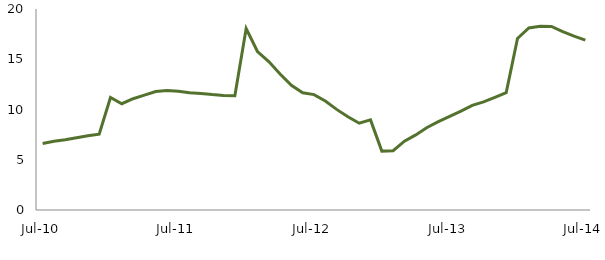
| Category | Series 0 |
|---|---|
| Jul-10 | 6.608 |
|  | 6.844 |
|  | 7 |
|  | 7.189 |
|  | 7.391 |
|  | 7.544 |
|  | 11.192 |
|  | 10.576 |
|  | 11.074 |
|  | 11.424 |
|  | 11.795 |
|  | 11.884 |
| Jul-11 | 11.821 |
|  | 11.67 |
|  | 11.588 |
|  | 11.481 |
|  | 11.403 |
|  | 11.374 |
|  | 18.05 |
|  | 15.769 |
|  | 14.767 |
|  | 13.533 |
|  | 12.403 |
|  | 11.663 |
| Jul-12 | 11.484 |
|  | 10.846 |
|  | 10.011 |
|  | 9.276 |
|  | 8.633 |
|  | 8.963 |
|  | 5.86 |
|  | 5.902 |
|  | 6.851 |
|  | 7.471 |
|  | 8.212 |
|  | 8.796 |
| Jul-13 | 9.326 |
|  | 9.847 |
|  | 10.415 |
|  | 10.762 |
|  | 11.207 |
|  | 11.678 |
|  | 17.072 |
|  | 18.112 |
|  | 18.284 |
|  | 18.263 |
|  | 17.75 |
|  | 17.299 |
| Jul-14 | 16.908 |